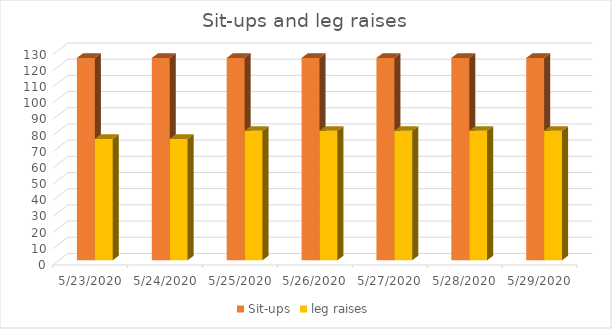
| Category | Sit-ups | leg raises |
|---|---|---|
| 5/23/20 | 125 | 75 |
| 5/24/20 | 125 | 75 |
| 5/25/20 | 125 | 80 |
| 5/26/20 | 125 | 80 |
| 5/27/20 | 125 | 80 |
| 5/28/20 | 125 | 80 |
| 5/29/20 | 125 | 80 |